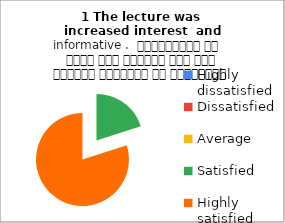
| Category | 1 The lecture was  increased interest  and informative .  व्याख्यान से रुचि में वृद्धि हुई एवं शिक्षण जानकारी से परिपूर्ण था |
|---|---|
| Highly dissatisfied | 0 |
| Dissatisfied | 0 |
| Average | 0 |
| Satisfied | 1 |
| Highly satisfied | 4 |